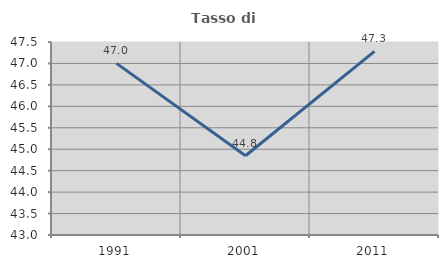
| Category | Tasso di occupazione   |
|---|---|
| 1991.0 | 47.002 |
| 2001.0 | 44.847 |
| 2011.0 | 47.281 |